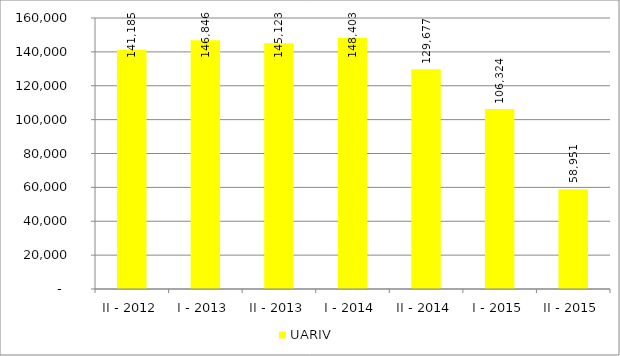
| Category | UARIV |
|---|---|
| II - 2012 | 141185 |
| I - 2013 | 146846 |
| II - 2013 | 145123 |
| I - 2014 | 148403 |
| II - 2014 | 129677 |
| I - 2015 | 106324 |
| II - 2015 | 58951 |